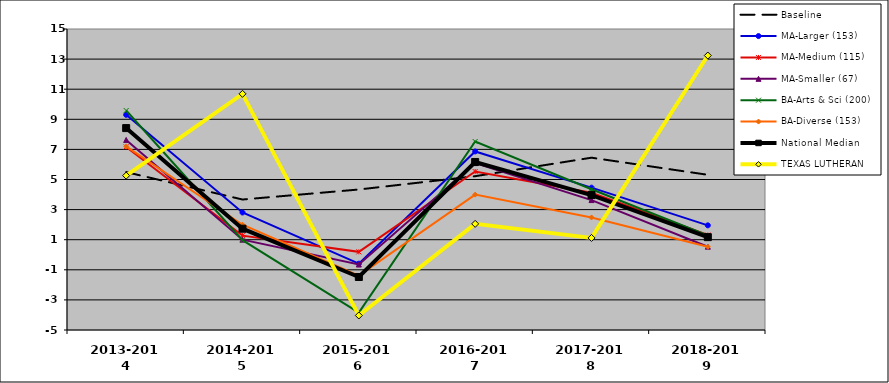
| Category | Baseline | MA-Larger (153) | MA-Medium (115) | MA-Smaller (67) | BA-Arts & Sci (200) | BA-Diverse (153) | National Median | TEXAS LUTHERAN |
|---|---|---|---|---|---|---|---|---|
| 2013-2014 | 5.492 | 9.297 | 7.164 | 7.629 | 9.583 | 7.202 | 8.415 | 5.258 |
| 2014-2015 | 3.67 | 2.808 | 1.27 | 1.003 | 0.968 | 1.996 | 1.73 | 10.692 |
| 2015-2016 | 4.335 | -0.593 | 0.193 | -0.651 | -3.843 | -1.392 | -1.479 | -4.036 |
| 2016-2017 | 5.22 | 6.864 | 5.529 | 6.09 | 7.525 | 3.996 | 6.164 | 2.053 |
| 2017-2018 | 6.45 | 4.457 | 4.118 | 3.633 | 4.352 | 2.478 | 3.963 | 1.117 |
| 2018-2019 | 5.311 | 1.954 | 1.308 | 0.534 | 1.276 | 0.529 | 1.169 | 13.237 |